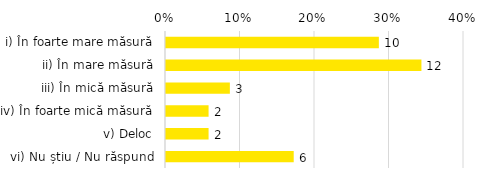
| Category | Total |
|---|---|
| i) În foarte mare măsură | 0.286 |
| ii) În mare măsură | 0.343 |
| iii) În mică măsură | 0.086 |
| iv) În foarte mică măsură | 0.057 |
| v) Deloc | 0.057 |
| vi) Nu știu / Nu răspund | 0.171 |